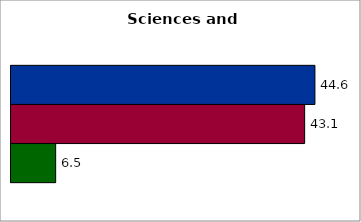
| Category | 50 states and D.C. | SREB states | State |
|---|---|---|---|
| 0 | 44.565 | 43.057 | 6.548 |